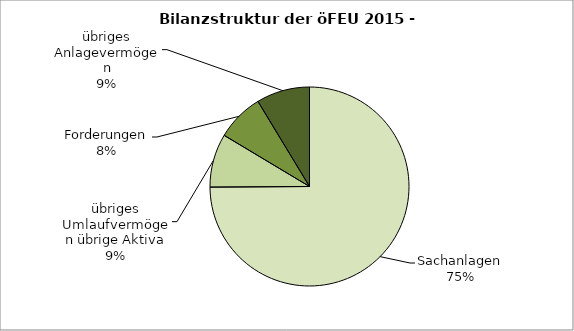
| Category | Series 0 |
|---|---|
| Sachanlagen | 74.918 |
| übriges Umlaufvermögen übrige Aktiva | 8.694 |
| Forderungen | 7.742 |
| übriges Anlagevermögen | 8.672 |